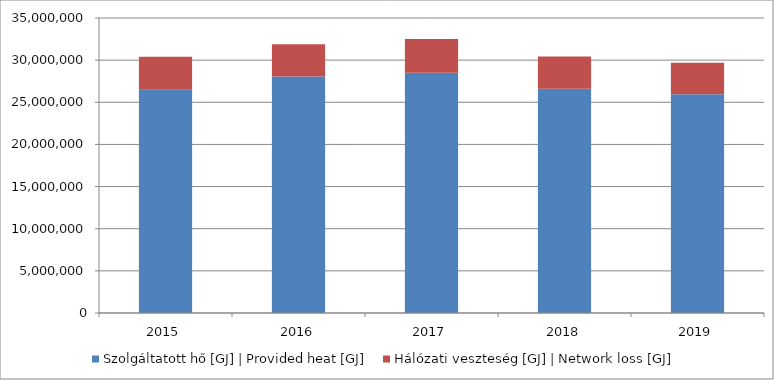
| Category | Szolgáltatott hő [GJ] | Provided heat [GJ] | Hálózati veszteség [GJ] | Network loss [GJ] |
|---|---|---|
| 2015.0 | 26491212.965 | 3898168.162 |
| 2016.0 | 28064065.995 | 3810370.045 |
| 2017.0 | 28514227.126 | 3999757.314 |
| 2018.0 | 26601195.365 | 3845502.321 |
| 2019.0 | 25940445.511 | 3750438.137 |